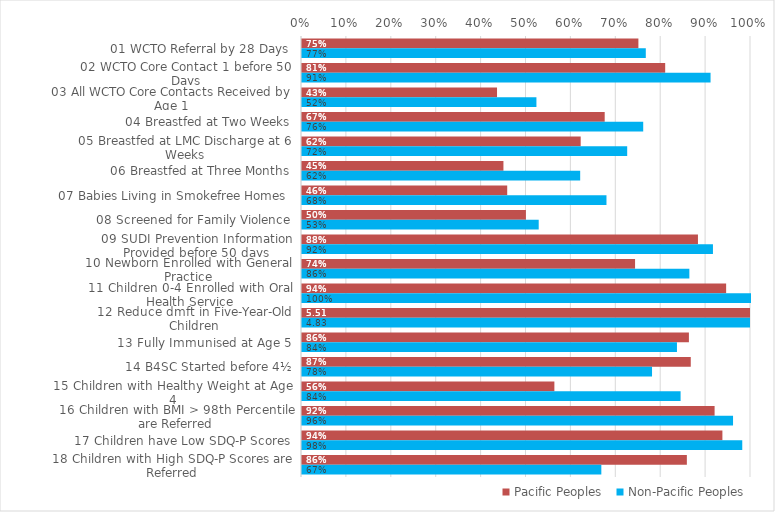
| Category | Pacific Peoples | Non-Pacific Peoples |
|---|---|---|
| 01 WCTO Referral by 28 Days | 0.749 | 0.766 |
| 02 WCTO Core Contact 1 before 50 Days | 0.809 | 0.91 |
| 03 All WCTO Core Contacts Received by Age 1 | 0.434 | 0.522 |
| 04 Breastfed at Two Weeks | 0.674 | 0.76 |
| 05 Breastfed at LMC Discharge at 6 Weeks | 0.621 | 0.724 |
| 06 Breastfed at Three Months | 0.449 | 0.62 |
| 07 Babies Living in Smokefree Homes  | 0.457 | 0.678 |
| 08 Screened for Family Violence | 0.499 | 0.527 |
| 09 SUDI Prevention Information Provided before 50 days | 0.882 | 0.915 |
| 10 Newborn Enrolled with General Practice | 0.742 | 0.863 |
| 11 Children 0-4 Enrolled with Oral Health Service | 0.945 | 1 |
| 12 Reduce dmft in Five-Year-Old Children | 5.513 | 4.833 |
| 13 Fully Immunised at Age 5 | 0.862 | 0.835 |
| 14 B4SC Started before 4½ | 0.866 | 0.78 |
| 15 Children with Healthy Weight at Age 4 | 0.562 | 0.843 |
| 16 Children with BMI > 98th Percentile are Referred | 0.919 | 0.96 |
| 17 Children have Low SDQ-P Scores | 0.936 | 0.981 |
| 18 Children with High SDQ-P Scores are Referred | 0.857 | 0.667 |